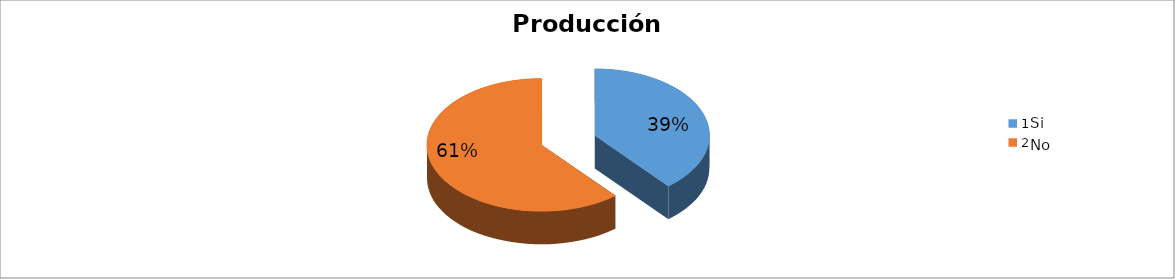
| Category | Series 0 |
|---|---|
| 0 | 0.389 |
| 1 | 0.611 |